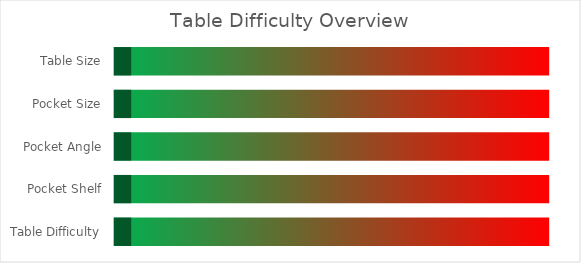
| Category | Series 0 |
|---|---|
| Table Difficulty | 100 |
| Pocket Shelf | 100 |
| Pocket Angle | 100 |
| Pocket Size | 100 |
| Table Size | 100 |